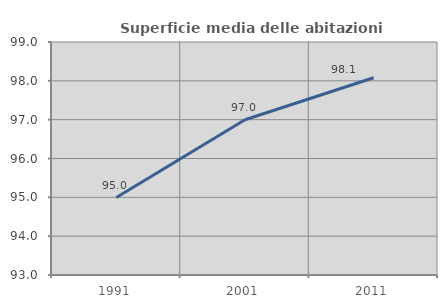
| Category | Superficie media delle abitazioni occupate |
|---|---|
| 1991.0 | 94.994 |
| 2001.0 | 96.997 |
| 2011.0 | 98.08 |